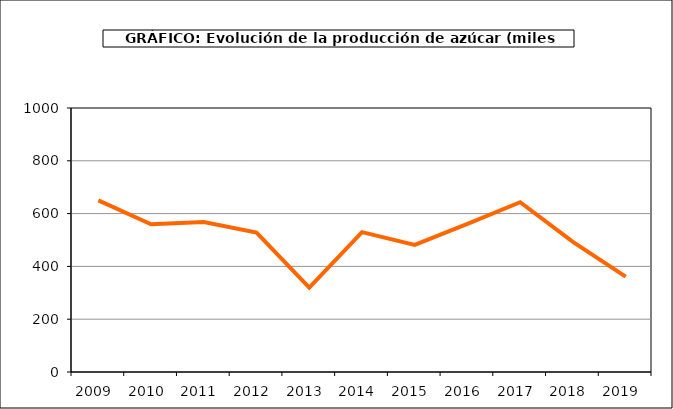
| Category | Producción |
|---|---|
| 2009.0 | 649.935 |
| 2010.0 | 559.795 |
| 2011.0 | 567.722 |
| 2012.0 | 528.414 |
| 2013.0 | 319.237 |
| 2014.0 | 529.794 |
| 2015.0 | 481.569 |
| 2016.0 | 560.897 |
| 2017.0 | 642.971 |
| 2018.0 | 493.179 |
| 2019.0 | 361.224 |